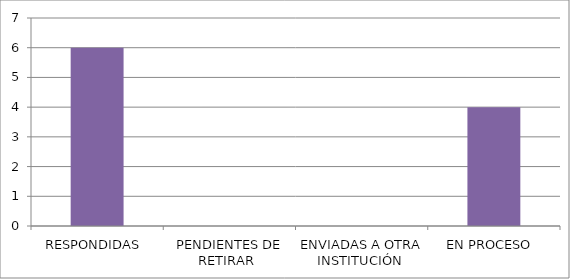
| Category | Series 0 |
|---|---|
| RESPONDIDAS  | 6 |
| PENDIENTES DE RETIRAR  | 0 |
| ENVIADAS A OTRA INSTITUCIÓN  | 0 |
| EN PROCESO  | 4 |